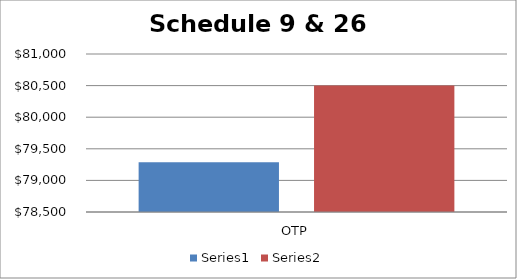
| Category | Series 0 | Series 1 |
|---|---|---|
| OTP | 79288.863 | 80502.731 |